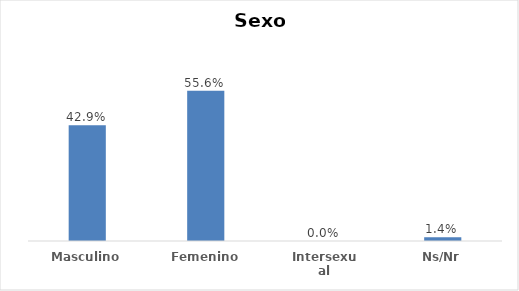
| Category | Series 0 |
|---|---|
| Masculino | 0.429 |
| Femenino | 0.556 |
| Intersexual | 0 |
| Ns/Nr | 0.014 |